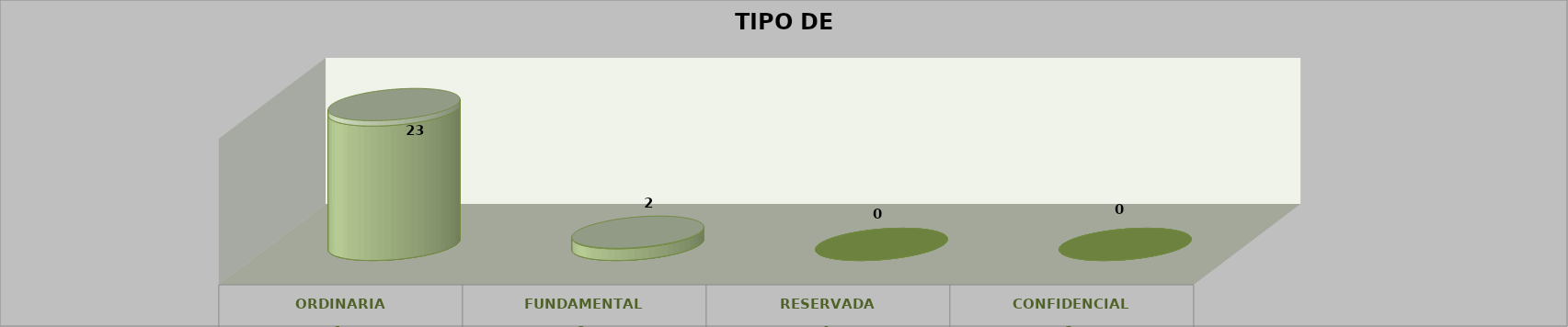
| Category | Series 0 | Series 2 | Series 1 | Series 3 | Series 4 |
|---|---|---|---|---|---|
| 0 |  |  |  | 23 | 0.92 |
| 1 |  |  |  | 2 | 0.08 |
| 2 |  |  |  | 0 | 0 |
| 3 |  |  |  | 0 | 0 |